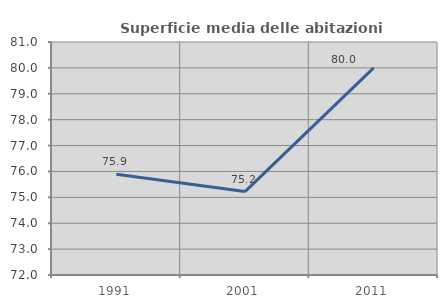
| Category | Superficie media delle abitazioni occupate |
|---|---|
| 1991.0 | 75.893 |
| 2001.0 | 75.223 |
| 2011.0 | 80 |